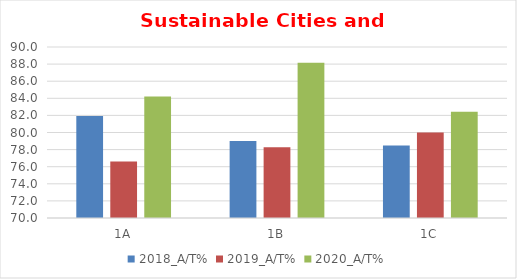
| Category | 2018_A/T% | 2019_A/T% | 2020_A/T% |
|---|---|---|---|
| 1A | 81.928 | 76.596 | 84.211 |
| 1B | 79.012 | 78.261 | 88.172 |
| 1C | 78.481 | 80 | 82.418 |